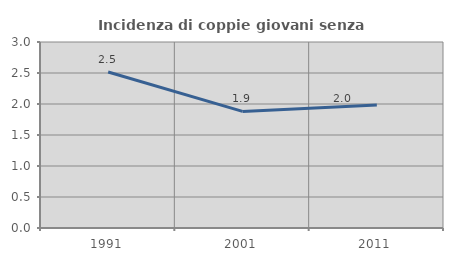
| Category | Incidenza di coppie giovani senza figli |
|---|---|
| 1991.0 | 2.516 |
| 2001.0 | 1.88 |
| 2011.0 | 1.983 |